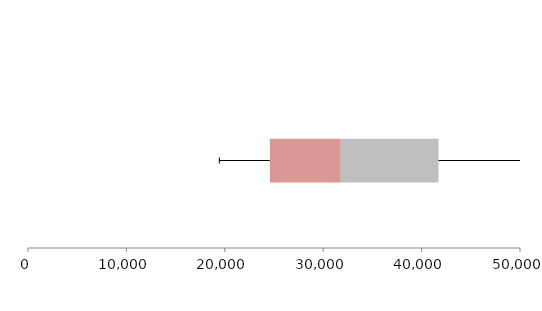
| Category | Series 1 | Series 2 | Series 3 |
|---|---|---|---|
| 0 | 24577.465 | 7201.948 | 9938.33 |